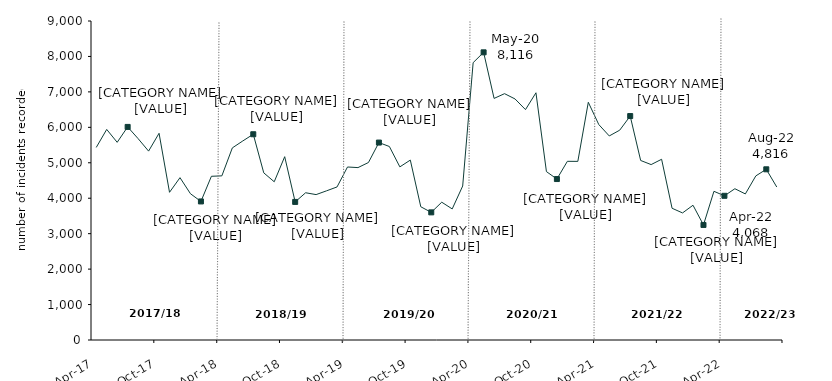
| Category | Series 0 |
|---|---|
| 2017-04-01 | 5433 |
| 2017-05-01 | 5941 |
| 2017-06-01 | 5577 |
| 2017-07-01 | 6012 |
| 2017-08-01 | 5681 |
| 2017-09-01 | 5329 |
| 2017-10-01 | 5832 |
| 2017-11-01 | 4167 |
| 2017-12-01 | 4580 |
| 2018-01-01 | 4127 |
| 2018-02-01 | 3909 |
| 2018-03-01 | 4619 |
| 2018-04-01 | 4631 |
| 2018-05-01 | 5420 |
| 2018-06-01 | 5616 |
| 2018-07-01 | 5805 |
| 2018-08-01 | 4716 |
| 2018-09-01 | 4464 |
| 2018-10-01 | 5172 |
| 2018-11-01 | 3896 |
| 2018-12-01 | 4154 |
| 2019-01-01 | 4102 |
| 2019-02-01 | 4209 |
| 2019-03-01 | 4318 |
| 2019-04-01 | 4881 |
| 2019-05-01 | 4864 |
| 2019-06-01 | 5007 |
| 2019-07-01 | 5570 |
| 2019-08-01 | 5459 |
| 2019-09-01 | 4884 |
| 2019-10-01 | 5076 |
| 2019-11-01 | 3759 |
| 2019-12-01 | 3601 |
| 2020-01-01 | 3888 |
| 2020-02-01 | 3698 |
| 2020-03-01 | 4344 |
| 2020-04-01 | 7825 |
| 2020-05-01 | 8116 |
| 2020-06-01 | 6816 |
| 2020-07-01 | 6950 |
| 2020-08-01 | 6801 |
| 2020-09-01 | 6500 |
| 2020-10-01 | 6975 |
| 2020-11-01 | 4751 |
| 2020-12-01 | 4541 |
| 2021-01-01 | 5041 |
| 2021-02-01 | 5040 |
| 2021-03-01 | 6707 |
| 2021-04-01 | 6079 |
| 2021-05-01 | 5757 |
| 2021-06-01 | 5920 |
| 2021-07-01 | 6318 |
| 2021-08-01 | 5065 |
| 2021-09-01 | 4949 |
| 2021-10-01 | 5099 |
| 2021-11-01 | 3717 |
| 2021-12-01 | 3585 |
| 2022-01-01 | 3802 |
| 2022-02-01 | 3246 |
| 2022-03-01 | 4195 |
| 2022-04-01 | 4068 |
| 2022-05-01 | 4268 |
| 2022-06-01 | 4121 |
| 2022-07-01 | 4630 |
| 2022-08-01 | 4816 |
| 2022-09-01 | 4316 |